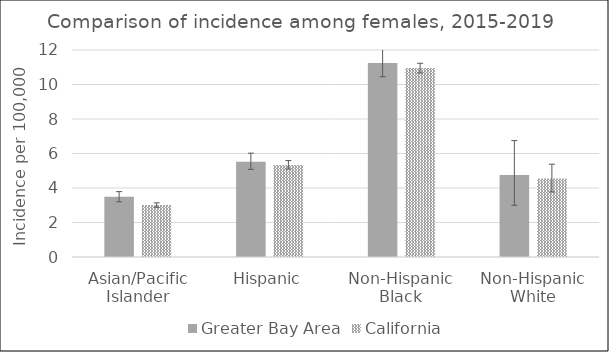
| Category | Greater Bay Area | California | SEER 18 |
|---|---|---|---|
| Asian/Pacific Islander | 3.49 | 3.01 |  |
| Hispanic | 5.52 | 5.34 |  |
| Non-Hispanic Black | 11.24 | 10.95 |  |
| Non-Hispanic White | 4.75 | 4.55 |  |